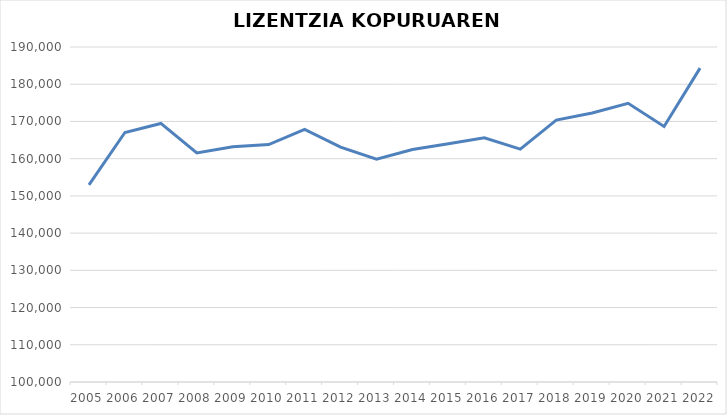
| Category | Series 0 |
|---|---|
| 2005.0 | 152983 |
| 2006.0 | 167044 |
| 2007.0 | 169465 |
| 2008.0 | 161531 |
| 2009.0 | 163217 |
| 2010.0 | 163804 |
| 2011.0 | 167891 |
| 2012.0 | 163119 |
| 2013.0 | 159884 |
| 2014.0 | 162441 |
| 2015.0 | 163990 |
| 2016.0 | 165617 |
| 2017.0 | 162557 |
| 2018.0 | 170364 |
| 2019.0 | 172284 |
| 2020.0 | 174875 |
| 2021.0 | 168649 |
| 2022.0 | 184321 |